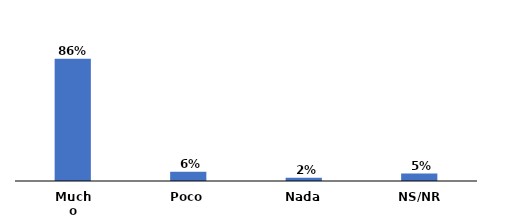
| Category | Series 0 |
|---|---|
| Mucho | 0.86 |
| Poco | 0.065 |
| Nada | 0.023 |
| NS/NR | 0.053 |